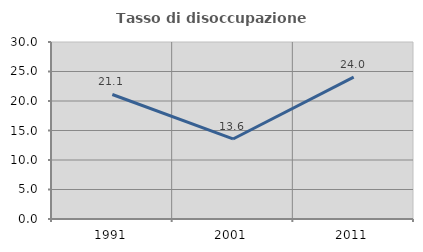
| Category | Tasso di disoccupazione giovanile  |
|---|---|
| 1991.0 | 21.103 |
| 2001.0 | 13.566 |
| 2011.0 | 24.038 |